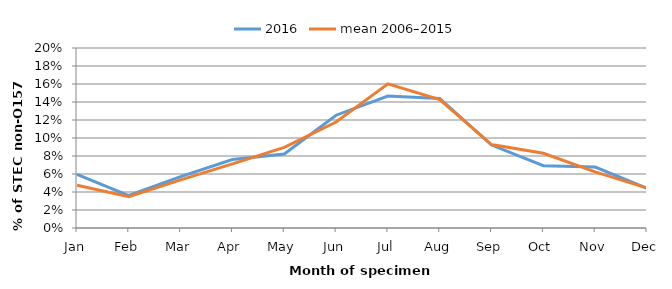
| Category | 2016 |
|---|---|
| Jan | 0.06 |
| Feb | 0.036 |
| Mar | 0.057 |
| Apr | 0.076 |
| May | 0.082 |
| Jun | 0.125 |
| Jul | 0.147 |
| Aug | 0.144 |
| Sep | 0.092 |
| Oct | 0.069 |
| Nov | 0.068 |
| Dec | 0.044 |